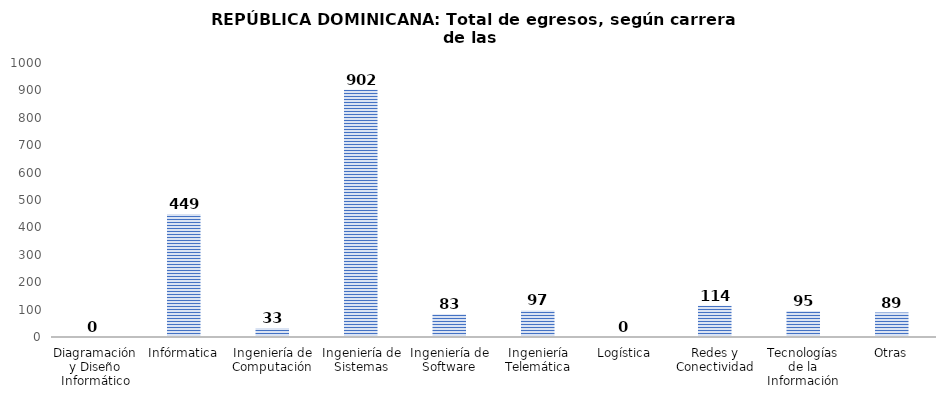
| Category | Series 0 |
|---|---|
| Diagramación y Diseño Informático | 0 |
| Infórmatica | 449 |
| Ingeniería de Computación | 33 |
| Ingeniería de Sistemas | 902 |
| Ingeniería de Software | 83 |
| Ingeniería Telemática | 97 |
| Logística | 0 |
| Redes y Conectividad | 114 |
| Tecnologías de la Información | 95 |
| Otras | 89 |